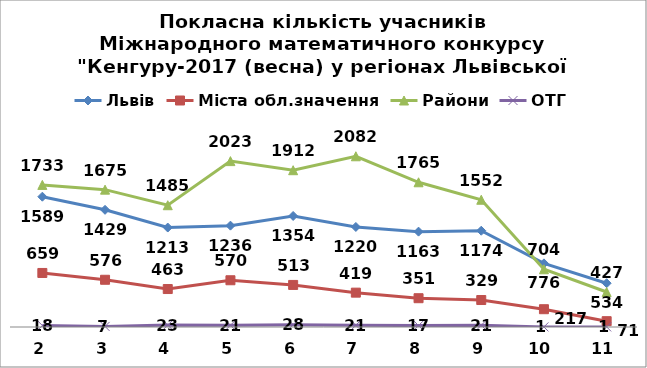
| Category | Львів | Міста обл.значення | Райони | ОТГ |
|---|---|---|---|---|
| 2.0 | 1589 | 659 | 1733 | 18 |
| 3.0 | 1429 | 576 | 1675 | 7 |
| 4.0 | 1213 | 463 | 1485 | 23 |
| 5.0 | 1236 | 570 | 2023 | 21 |
| 6.0 | 1354 | 513 | 1912 | 28 |
| 7.0 | 1220 | 419 | 2082 | 21 |
| 8.0 | 1163 | 351 | 1765 | 17 |
| 9.0 | 1174 | 329 | 1552 | 21 |
| 10.0 | 776 | 217 | 704 | 1 |
| 11.0 | 534 | 71 | 427 | 1 |